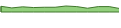
| Category | Series 0 |
|---|---|
| 0 | 95 |
| 1 | 68 |
| 2 | 86 |
| 3 | 74 |
| 4 | 79 |
| 5 | 79 |
| 6 | 100 |
| 7 | 90 |
| 8 | 63 |
| 9 | 90 |
| 10 | 90 |
| 11 | 57 |